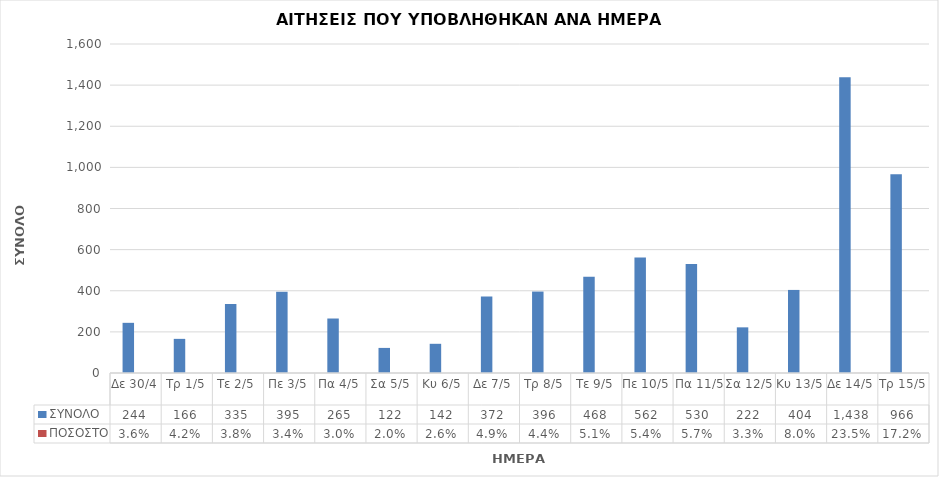
| Category | ΣΥΝΟΛΟ | ΠΟΣΟΣΤΟ |
|---|---|---|
| Δε 30/4 | 244 | 0.036 |
| Τρ 1/5 | 166 | 0.042 |
| Τε 2/5 | 335 | 0.038 |
| Πε 3/5 | 395 | 0.034 |
| Πα 4/5 | 265 | 0.03 |
| Σα 5/5 | 122 | 0.02 |
| Κυ 6/5 | 142 | 0.026 |
| Δε 7/5 | 372 | 0.049 |
| Τρ 8/5 | 396 | 0.044 |
| Τε 9/5 | 468 | 0.051 |
| Πε 10/5 | 562 | 0.054 |
| Πα 11/5 | 530 | 0.057 |
| Σα 12/5 | 222 | 0.033 |
| Κυ 13/5 | 404 | 0.08 |
| Δε 14/5 | 1438 | 0.235 |
| Τρ 15/5 | 966 | 0.172 |